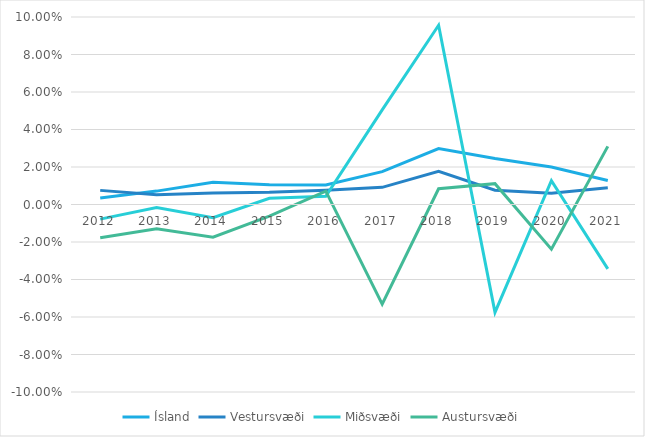
| Category | Ísland | Vestursvæði | Miðsvæði | Austursvæði |
|---|---|---|---|---|
| 2012.0 | 0.004 | 0.008 | -0.008 | -0.018 |
| 2013.0 | 0.007 | 0.005 | -0.002 | -0.013 |
| 2014.0 | 0.012 | 0.006 | -0.007 | -0.017 |
| 2015.0 | 0.011 | 0.007 | 0.003 | -0.006 |
| 2016.0 | 0.01 | 0.008 | 0.004 | 0.007 |
| 2017.0 | 0.018 | 0.009 | 0.05 | -0.053 |
| 2018.0 | 0.03 | 0.018 | 0.096 | 0.008 |
| 2019.0 | 0.025 | 0.008 | -0.058 | 0.011 |
| 2020.0 | 0.02 | 0.006 | 0.013 | -0.024 |
| 2021.0 | 0.013 | 0.009 | -0.034 | 0.031 |